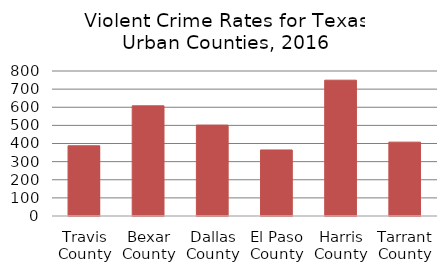
| Category | Series 0 |
|---|---|
| Travis County | 387.428 |
| Bexar County | 607.909 |
| Dallas County | 501.381 |
| El Paso County | 364.356 |
| Harris County | 749.252 |
| Tarrant County | 407.443 |